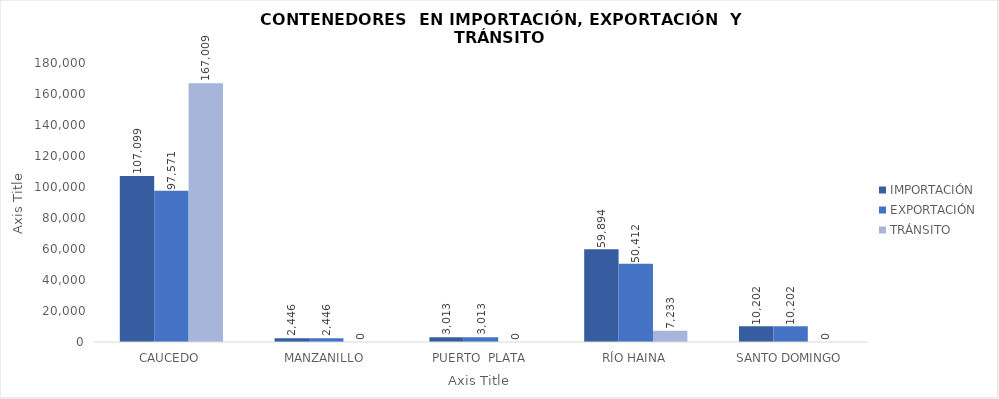
| Category | IMPORTACIÓN  | EXPORTACIÓN  | TRÁNSITO |
|---|---|---|---|
| CAUCEDO | 107098.5 | 97571.25 | 167008.5 |
| MANZANILLO | 2446 | 2446 | 0 |
| PUERTO  PLATA | 3013.25 | 3013.25 | 0 |
| RÍO HAINA | 59894.25 | 50411.5 | 7232.75 |
| SANTO DOMINGO | 10202 | 10202 | 0 |